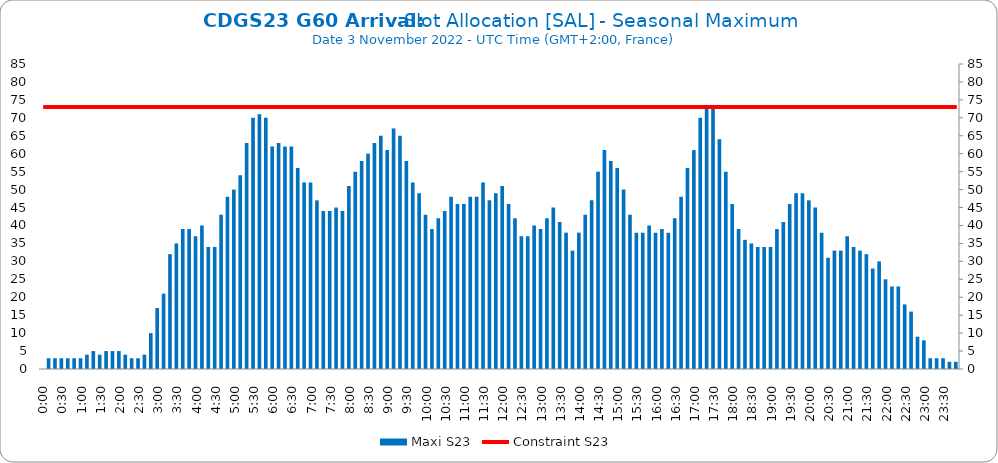
| Category | Maxi S23 |
|---|---|
| 0.0 | 0 |
| 0.006944444444444444 | 3 |
| 0.013888888888888888 | 3 |
| 0.020833333333333332 | 3 |
| 0.027777777777777776 | 3 |
| 0.034722222222222224 | 3 |
| 0.041666666666666664 | 3 |
| 0.04861111111111111 | 4 |
| 0.05555555555555555 | 5 |
| 0.0625 | 4 |
| 0.06944444444444443 | 5 |
| 0.0763888888888889 | 5 |
| 0.08333333333333333 | 5 |
| 0.09027777777777778 | 4 |
| 0.09722222222222222 | 3 |
| 0.10416666666666667 | 3 |
| 0.1111111111111111 | 4 |
| 0.11805555555555557 | 10 |
| 0.125 | 17 |
| 0.13194444444444445 | 21 |
| 0.1388888888888889 | 32 |
| 0.14583333333333334 | 35 |
| 0.15277777777777776 | 39 |
| 0.15972222222222224 | 39 |
| 0.16666666666666666 | 37 |
| 0.17361111111111113 | 40 |
| 0.18055555555555555 | 34 |
| 0.1875 | 34 |
| 0.19444444444444445 | 43 |
| 0.20138888888888887 | 48 |
| 0.20833333333333334 | 50 |
| 0.2152777777777778 | 54 |
| 0.2222222222222222 | 63 |
| 0.22916666666666666 | 70 |
| 0.23611111111111113 | 71 |
| 0.24305555555555555 | 70 |
| 0.25 | 62 |
| 0.2569444444444445 | 63 |
| 0.2638888888888889 | 62 |
| 0.2708333333333333 | 62 |
| 0.2777777777777778 | 56 |
| 0.2847222222222222 | 52 |
| 0.2916666666666667 | 52 |
| 0.2986111111111111 | 47 |
| 0.3055555555555555 | 44 |
| 0.3125 | 44 |
| 0.3194444444444445 | 45 |
| 0.3263888888888889 | 44 |
| 0.3333333333333333 | 51 |
| 0.34027777777777773 | 55 |
| 0.34722222222222227 | 58 |
| 0.3541666666666667 | 60 |
| 0.3611111111111111 | 63 |
| 0.3680555555555556 | 65 |
| 0.375 | 61 |
| 0.3819444444444444 | 67 |
| 0.3888888888888889 | 65 |
| 0.3958333333333333 | 58 |
| 0.40277777777777773 | 52 |
| 0.40972222222222227 | 49 |
| 0.4166666666666667 | 43 |
| 0.4236111111111111 | 39 |
| 0.4305555555555556 | 42 |
| 0.4375 | 44 |
| 0.4444444444444444 | 48 |
| 0.4513888888888889 | 46 |
| 0.4583333333333333 | 46 |
| 0.46527777777777773 | 48 |
| 0.47222222222222227 | 48 |
| 0.4791666666666667 | 52 |
| 0.4861111111111111 | 47 |
| 0.4930555555555556 | 49 |
| 0.5 | 51 |
| 0.5069444444444444 | 46 |
| 0.513888888888889 | 42 |
| 0.5208333333333334 | 37 |
| 0.5277777777777778 | 37 |
| 0.5347222222222222 | 40 |
| 0.5416666666666666 | 39 |
| 0.548611111111111 | 42 |
| 0.5555555555555556 | 45 |
| 0.5625 | 41 |
| 0.5694444444444444 | 38 |
| 0.576388888888889 | 33 |
| 0.5833333333333334 | 38 |
| 0.5902777777777778 | 43 |
| 0.5972222222222222 | 47 |
| 0.6041666666666666 | 55 |
| 0.611111111111111 | 61 |
| 0.6180555555555556 | 58 |
| 0.625 | 56 |
| 0.6319444444444444 | 50 |
| 0.638888888888889 | 43 |
| 0.6458333333333334 | 38 |
| 0.6527777777777778 | 38 |
| 0.6597222222222222 | 40 |
| 0.6666666666666666 | 38 |
| 0.6736111111111112 | 39 |
| 0.6805555555555555 | 38 |
| 0.6875 | 42 |
| 0.6944444444444445 | 48 |
| 0.7013888888888888 | 56 |
| 0.7083333333333334 | 61 |
| 0.7152777777777778 | 70 |
| 0.7222222222222222 | 73 |
| 0.7291666666666666 | 73 |
| 0.7361111111111112 | 64 |
| 0.7430555555555555 | 55 |
| 0.75 | 46 |
| 0.7569444444444445 | 39 |
| 0.7638888888888888 | 36 |
| 0.7708333333333334 | 35 |
| 0.7777777777777778 | 34 |
| 0.7847222222222222 | 34 |
| 0.7916666666666666 | 34 |
| 0.7986111111111112 | 39 |
| 0.8055555555555555 | 41 |
| 0.8125 | 46 |
| 0.8194444444444445 | 49 |
| 0.8263888888888888 | 49 |
| 0.8333333333333334 | 47 |
| 0.8402777777777778 | 45 |
| 0.8472222222222222 | 38 |
| 0.8541666666666666 | 31 |
| 0.8611111111111112 | 33 |
| 0.8680555555555555 | 33 |
| 0.875 | 37 |
| 0.8819444444444445 | 34 |
| 0.8888888888888888 | 33 |
| 0.8958333333333334 | 32 |
| 0.9027777777777778 | 28 |
| 0.9097222222222222 | 30 |
| 0.9166666666666666 | 25 |
| 0.9236111111111112 | 23 |
| 0.9305555555555555 | 23 |
| 0.9375 | 18 |
| 0.9444444444444445 | 16 |
| 0.9513888888888888 | 9 |
| 0.9583333333333334 | 8 |
| 0.9652777777777778 | 3 |
| 0.9722222222222222 | 3 |
| 0.9791666666666666 | 3 |
| 0.9861111111111112 | 2 |
| 0.9930555555555555 | 2 |